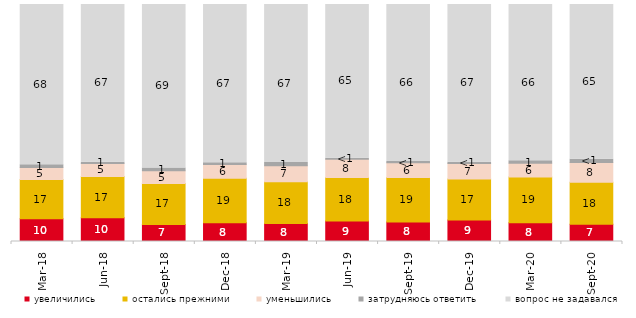
| Category | увеличились | остались прежними | уменьшились | затрудняюсь ответить | вопрос не задавался |
|---|---|---|---|---|---|
| 2018-03-01 | 9.55 | 16.65 | 5.05 | 1.1 | 67.65 |
| 2018-06-01 | 10 | 17.45 | 5.45 | 0.55 | 66.55 |
| 2018-09-01 | 7.2 | 17.3 | 5.3 | 1.2 | 69 |
| 2018-12-01 | 7.9 | 18.8 | 5.8 | 0.75 | 66.75 |
| 2019-03-01 | 7.608 | 17.653 | 6.713 | 1.343 | 66.683 |
| 2019-06-01 | 8.678 | 18.354 | 7.631 | 0.499 | 64.838 |
| 2019-09-01 | 8.267 | 18.762 | 6.188 | 0.495 | 66.287 |
| 2019-12-01 | 9.059 | 17.277 | 6.584 | 0.495 | 66.584 |
| 2020-03-01 | 7.883 | 19.336 | 5.801 | 1.041 | 65.94 |
| 2020-09-01 | 7.317 | 17.67 | 8.313 | 1.394 | 65.306 |